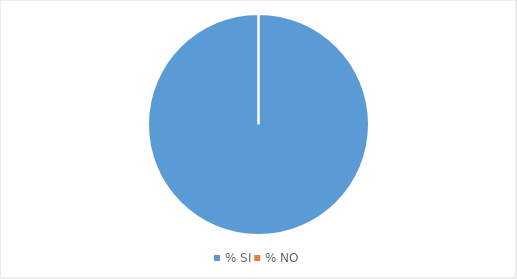
| Category | Series 0 | Series 1 | Series 2 | Series 3 | Series 4 | Series 5 | Series 6 | Series 7 | Series 8 | Series 9 |
|---|---|---|---|---|---|---|---|---|---|---|
| % SI | 8.072 | 8.072 | 6.278 | 8.969 | 13.004 | 12.556 | 11.211 | 12.108 | 8.969 | 9.865 |
| % NO | 0 | 0 | 0 | 0 | 0 | 0.448 | 0 | 0 | 0.448 | 0 |